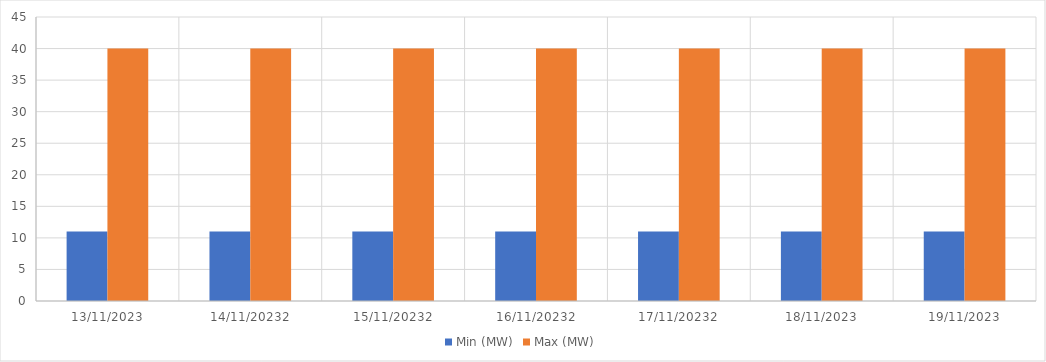
| Category | Min (MW) | Max (MW) |
|---|---|---|
| 13/11/2023 | 11 | 40 |
| 14/11/20232 | 11 | 40 |
| 15/11/20232 | 11 | 40 |
| 16/11/20232 | 11 | 40 |
| 17/11/20232 | 11 | 40 |
| 18/11/2023 | 11 | 40 |
| 19/11/2023 | 11 | 40 |